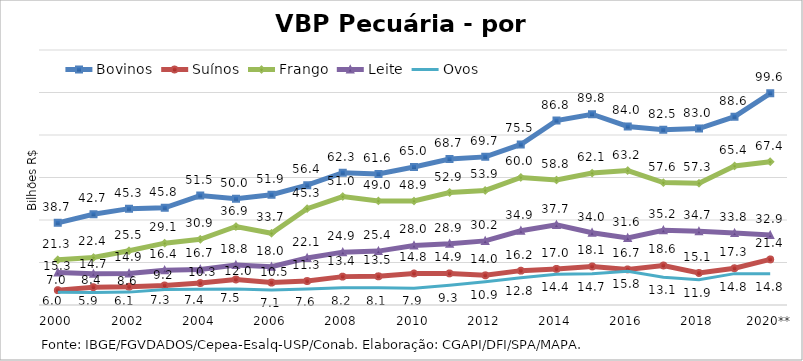
| Category | Bovinos | Suínos | Frango | Leite | Ovos |
|---|---|---|---|---|---|
| 2000 | 38.653 | 6.999 | 21.269 | 15.267 | 5.969 |
| 2001 | 42.727 | 8.396 | 22.355 | 14.692 | 5.882 |
| 2002 | 45.341 | 8.606 | 25.518 | 14.876 | 6.061 |
| 2003 | 45.761 | 9.197 | 29.092 | 16.382 | 7.331 |
| 2004 | 51.487 | 10.341 | 30.892 | 16.743 | 7.43 |
| 2005 | 49.986 | 11.989 | 36.933 | 18.831 | 7.48 |
| 2006 | 51.898 | 10.546 | 33.74 | 17.987 | 7.106 |
| 2007 | 56.401 | 11.277 | 45.334 | 22.113 | 7.552 |
| 2008 | 62.274 | 13.353 | 51.031 | 24.876 | 8.156 |
| 2009 | 61.624 | 13.498 | 48.997 | 25.361 | 8.132 |
| 2010 | 64.97 | 14.849 | 48.938 | 28.008 | 7.909 |
| 2011 | 68.684 | 14.872 | 52.929 | 28.872 | 9.32 |
| 2012 | 69.708 | 13.964 | 53.916 | 30.171 | 10.925 |
| 2013 | 75.538 | 16.169 | 60.01 | 34.913 | 12.849 |
| 2014 | 86.78 | 16.982 | 58.796 | 37.702 | 14.437 |
| 2015 | 89.766 | 18.149 | 62.07 | 34.032 | 14.7 |
| 2016 | 84.026 | 16.749 | 63.245 | 31.578 | 15.847 |
| 2017 | 82.457 | 18.593 | 57.605 | 35.184 | 13.062 |
| 2018 | 83.009 | 15.058 | 57.291 | 34.661 | 11.878 |
| 2019 | 88.647 | 17.294 | 65.423 | 33.847 | 14.76 |
| 2020** | 99.598 | 21.448 | 67.436 | 32.897 | 14.755 |